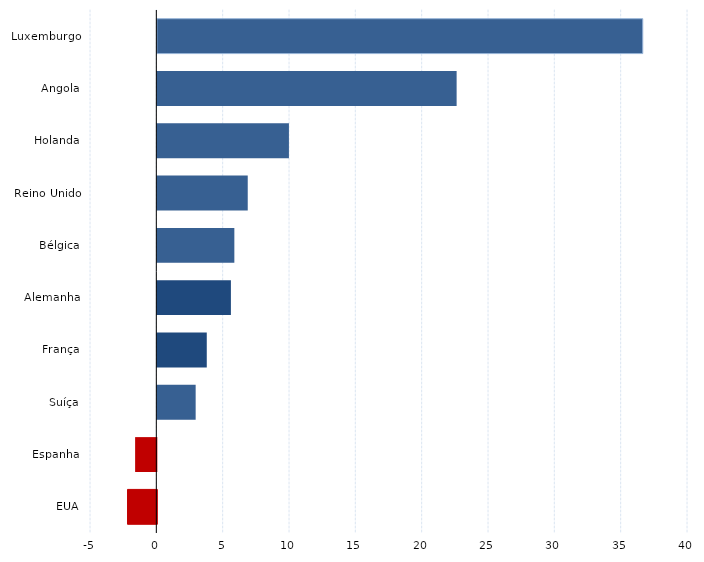
| Category | Series 0 |
|---|---|
| Luxemburgo | 36.59 |
| Angola | 22.56 |
| Holanda | 9.919 |
| Reino Unido | 6.814 |
| Bélgica | 5.805 |
| Alemanha | 5.545 |
| França | 3.727 |
| Suíça | 2.889 |
| Espanha | -1.599 |
| EUA | -2.203 |